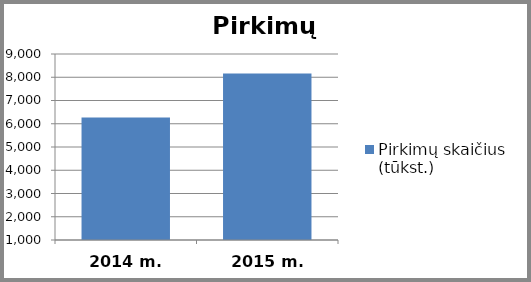
| Category | Pirkimų skaičius (tūkst.) |
|---|---|
| 2014 m. | 6272 |
| 2015 m. | 8163 |